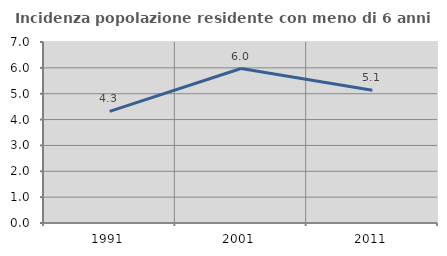
| Category | Incidenza popolazione residente con meno di 6 anni |
|---|---|
| 1991.0 | 4.319 |
| 2001.0 | 5.975 |
| 2011.0 | 5.131 |